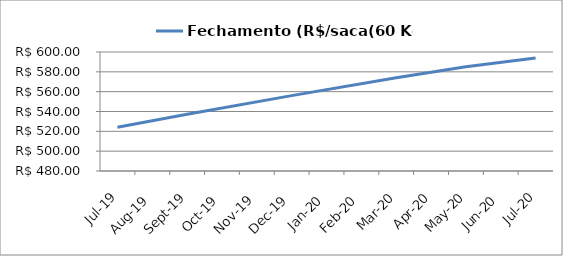
| Category | Fechamento (R$/saca(60 Kg) |
|---|---|
| 2019-07-01 | 524.17 |
| 2019-09-01 | 537.27 |
| 2019-12-01 | 556.02 |
| 2020-03-01 | 574 |
| 2020-05-01 | 585.04 |
| 2020-07-01 | 594.03 |